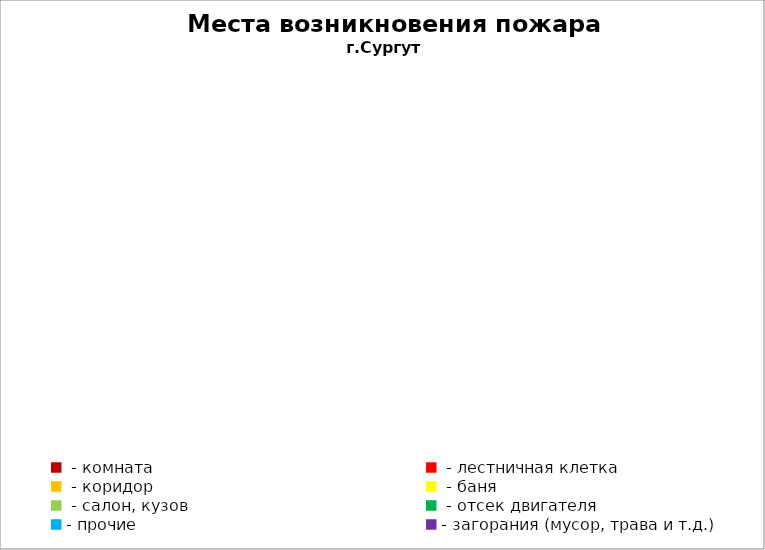
| Category | Места возникновения пожара |
|---|---|
|  - комната | 15 |
|  - лестничная клетка | 7 |
|  - коридор | 3 |
|  - баня | 10 |
|  - салон, кузов | 3 |
|  - отсек двигателя | 5 |
| - прочие | 14 |
| - загорания (мусор, трава и т.д.)  | 23 |